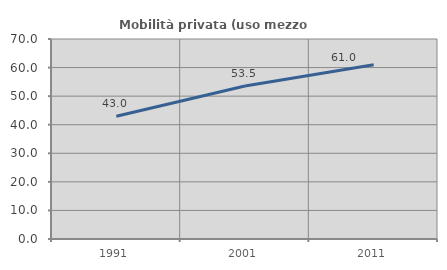
| Category | Mobilità privata (uso mezzo privato) |
|---|---|
| 1991.0 | 42.991 |
| 2001.0 | 53.541 |
| 2011.0 | 61.022 |